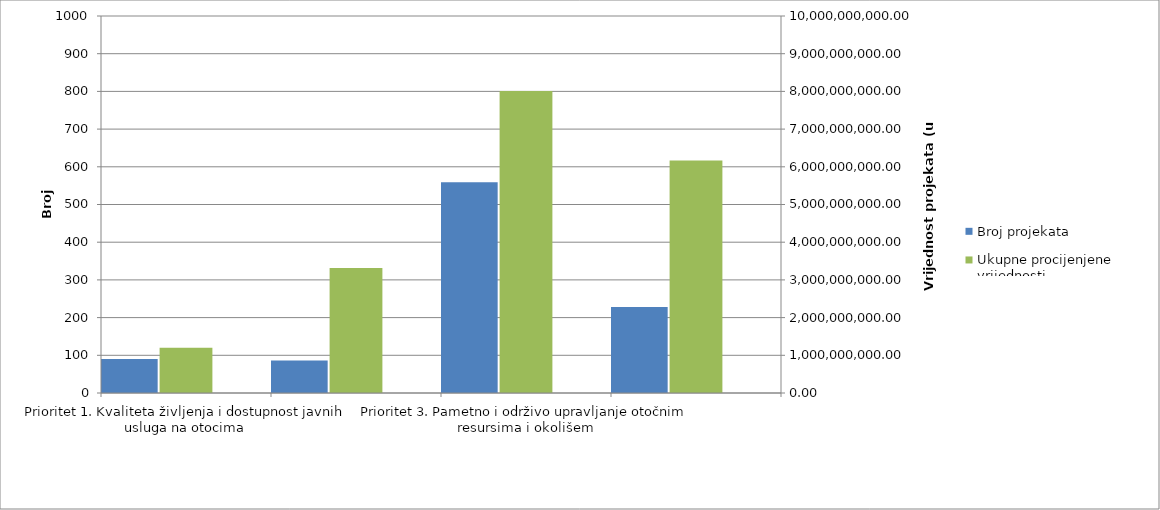
| Category | Broj projekata | Series 1 |
|---|---|---|
| Prioritet 1. Kvaliteta življenja i dostupnost javnih usluga na otocima | 90 |  |
| Prioritet 2. Održivi razvoj otočnog gospodarstva | 86 |  |
| Prioritet 3. Pametno i održivo upravljanje otočnim resursima i okolišem | 559 |  |
| Prioritet 4. Mobilnost i povezivost otočnog prostora | 228 |  |